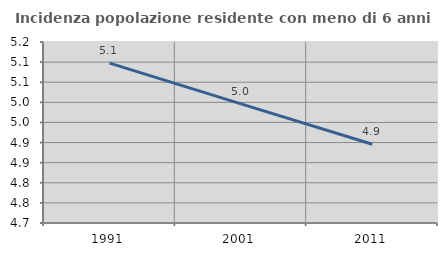
| Category | Incidenza popolazione residente con meno di 6 anni |
|---|---|
| 1991.0 | 5.097 |
| 2001.0 | 4.996 |
| 2011.0 | 4.896 |